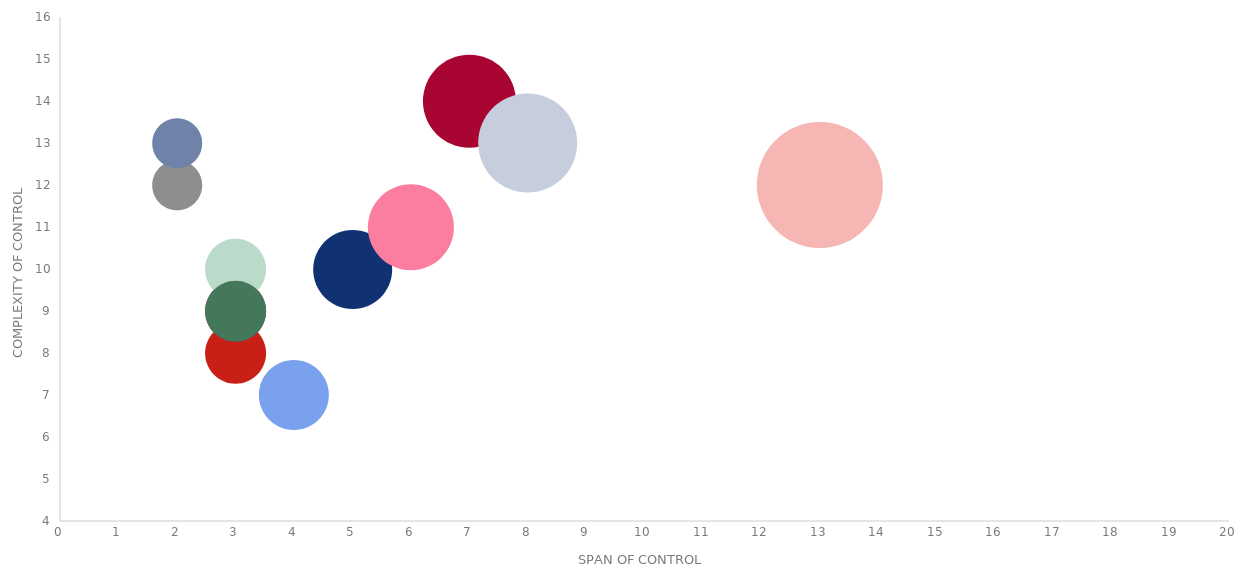
| Category | Complexidade de Controlo |
|---|---|
| 13.0 | 12 |
| 3.0 | 8 |
| 4.0 | 7 |
| 5.0 | 10 |
| 3.0 | 9 |
| 2.0 | 12 |
| 6.0 | 11 |
| 7.0 | 14 |
| 8.0 | 13 |
| 2.0 | 13 |
| 3.0 | 10 |
| 3.0 | 9 |